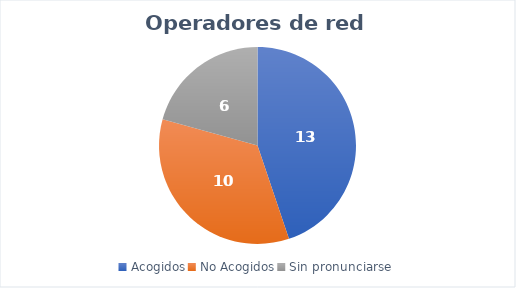
| Category | Series 0 |
|---|---|
| Acogidos | 13 |
| No Acogidos | 10 |
| Sin pronunciarse | 6 |